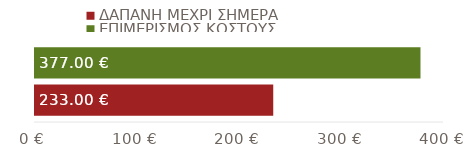
| Category | ΔΑΠΑΝΗ ΜΕΧΡΙ ΣΗΜΕΡΑ | ΕΠΙΜΕΡΙΣΜΟΣ ΚΟΣΤΟΥΣ |
|---|---|---|
| ΣΥΝΟΛΑ | 233 | 377 |